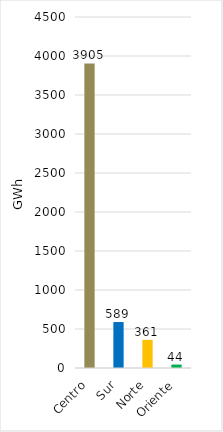
| Category | Series 0 |
|---|---|
| Centro | 3904.597 |
| Sur | 589.153 |
| Norte | 361.221 |
| Oriente | 44.245 |